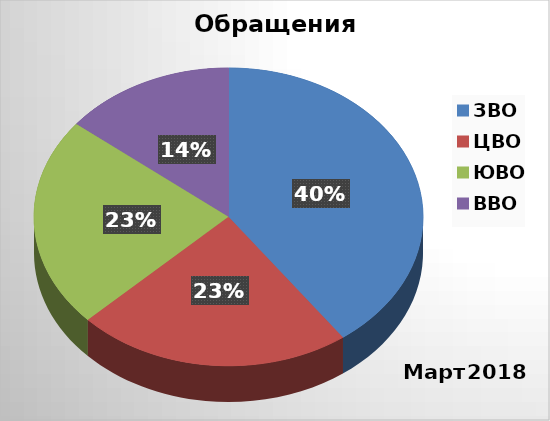
| Category | Series 0 |
|---|---|
| ЗВО | 14 |
| ЦВО | 8 |
| ЮВО | 8 |
| ВВО | 5 |